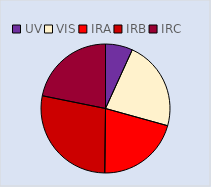
| Category | Series 0 |
|---|---|
| UV | 200898.165 |
| VIS | 663154.499 |
| IRA | 615589.214 |
| IRB | 825262.917 |
| IRC | 643781.82 |